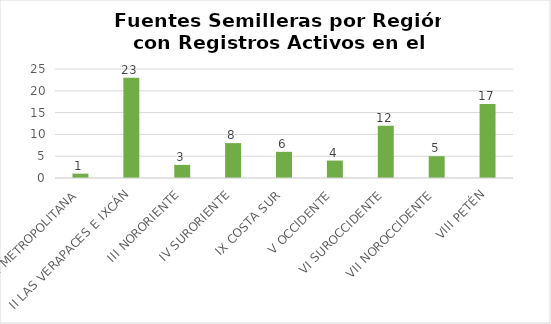
| Category | Series 0 |
|---|---|
| I METROPOLITANA | 1 |
| II LAS VERAPACES E IXCÁN | 23 |
| III NORORIENTE | 3 |
| IV SURORIENTE | 8 |
| IX COSTA SUR | 6 |
| V OCCIDENTE | 4 |
| VI SUROCCIDENTE | 12 |
| VII NOROCCIDENTE | 5 |
| VIII PETÉN | 17 |